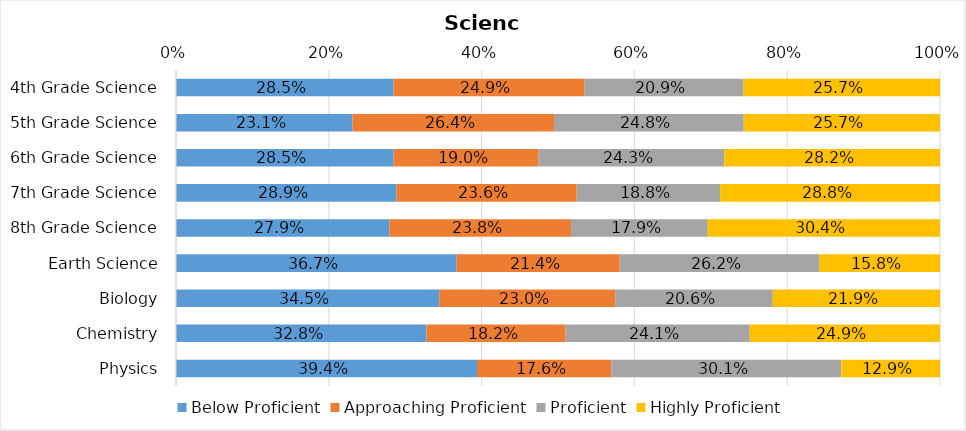
| Category | Below Proficient | Approaching Proficient | Proficient | Highly Proficient |
|---|---|---|---|---|
| 4th Grade Science | 0.285 | 0.249 | 0.209 | 0.257 |
| 5th Grade Science | 0.231 | 0.264 | 0.248 | 0.257 |
| 6th Grade Science | 0.285 | 0.19 | 0.243 | 0.282 |
| 7th Grade Science | 0.289 | 0.236 | 0.188 | 0.288 |
| 8th Grade Science | 0.279 | 0.238 | 0.179 | 0.304 |
| Earth Science | 0.367 | 0.214 | 0.262 | 0.158 |
| Biology | 0.345 | 0.23 | 0.206 | 0.219 |
| Chemistry | 0.328 | 0.182 | 0.241 | 0.249 |
| Physics | 0.394 | 0.176 | 0.301 | 0.129 |